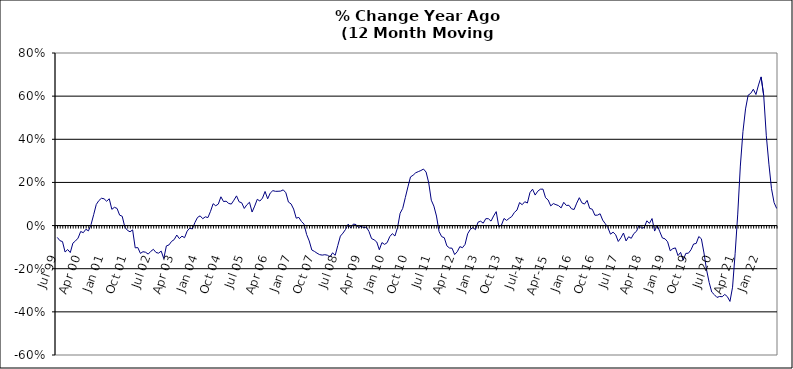
| Category | Series 0 |
|---|---|
| Jul 99 | -0.055 |
| Aug 99 | -0.07 |
| Sep 99 | -0.074 |
| Oct 99 | -0.123 |
| Nov 99 | -0.111 |
| Dec 99 | -0.125 |
| Jan 00 | -0.082 |
| Feb 00 | -0.071 |
| Mar 00 | -0.058 |
| Apr 00 | -0.027 |
| May 00 | -0.033 |
| Jun 00 | -0.017 |
| Jul 00 | -0.025 |
| Aug 00 | 0.005 |
| Sep 00 | 0.05 |
| Oct 00 | 0.098 |
| Nov 00 | 0.116 |
| Dec 00 | 0.127 |
| Jan 01 | 0.124 |
| Feb 01 | 0.113 |
| Mar 01 | 0.124 |
| Apr 01 | 0.075 |
| May 01 | 0.085 |
| Jun 01 | 0.08 |
| Jul 01 | 0.048 |
| Aug 01 | 0.043 |
| Sep 01 | -0.007 |
| Oct 01 | -0.022 |
| Nov 01 | -0.029 |
| Dec 01 | -0.02 |
| Jan 02 | -0.103 |
| Feb 02 | -0.102 |
| Mar 02 | -0.129 |
| Apr 02 | -0.121 |
| May 02 | -0.124 |
| Jun 02 | -0.132 |
| Jul 02 | -0.119 |
| Aug 02 | -0.11 |
| Sep 02 | -0.125 |
| Oct 02 | -0.128 |
| Nov 02 | -0.118 |
| Dec 02 | -0.153 |
| Jan 03 | -0.094 |
| Feb 03 | -0.09 |
| Mar 03 | -0.073 |
| Apr 03 | -0.065 |
| May 03 | -0.044 |
| Jun 03 | -0.06 |
| Jul 03 | -0.049 |
| Aug 03 | -0.056 |
| Sep 03 | -0.026 |
| Oct 03 | -0.012 |
| Nov 03 | -0.016 |
| Dec 03 | 0.014 |
| Jan 04 | 0.038 |
| Feb 04 | 0.045 |
| Mar 04 | 0.032 |
| Apr 04 | 0.041 |
| May 04 | 0.037 |
| Jun 04 | 0.066 |
| Jul 04 | 0.101 |
| Aug 04 | 0.092 |
| Sep 04 | 0.1 |
| Oct 04 | 0.133 |
| Nov 04 | 0.111 |
| Dec 04 | 0.113 |
| Jan 05 | 0.103 |
| Feb 05 | 0.1 |
| Mar 05 | 0.118 |
| Apr 05 | 0.138 |
| May 05 | 0.11 |
| Jun 05 | 0.106 |
| Jul 05 | 0.079 |
| Aug 05 | 0.097 |
| Sep 05 | 0.108 |
| Oct 05 | 0.063 |
| Nov 05 | 0.09 |
| Dec 05 | 0.122 |
| Jan 06 | 0.114 |
| Feb 06 | 0.127 |
| Mar 06 | 0.158 |
| Apr 06 | 0.124 |
| May 06 | 0.151 |
| Jun 06 | 0.162 |
| Jul 06 | 0.159 |
| Aug 06 | 0.159 |
| Sep 06 | 0.16 |
| Oct 06 | 0.166 |
| Nov 06 | 0.152 |
| Dec 06 | 0.109 |
| Jan 07 | 0.101 |
| Feb 07 | 0.076 |
| Mar 07 | 0.034 |
| Apr 07 | 0.038 |
| May 07 | 0.019 |
| Jun 07 | 0.007 |
| Jul 07 | -0.041 |
| Aug 07 | -0.071 |
| Sep 07 | -0.113 |
| Oct 07 | -0.12 |
| Nov 07 | -0.128 |
| Dec 07 | -0.135 |
| Jan 08 | -0.137 |
| Feb 08 | -0.135 |
| Mar 08 | -0.137 |
| Apr 08 | -0.145 |
| May 08 | -0.126 |
| Jun 08 | -0.138 |
| Jul 08 | -0.093 |
| Aug 08 | -0.049 |
| Sep-08 | -0.035 |
| Oct 08 | -0.018 |
| Nov 08 | 0.007 |
| Dec 08 | -0.011 |
| Jan 09 | 0.007 |
| Feb 09 | 0.005 |
| Mar 09 | -0.009 |
| Apr 09 | -0.003 |
| May 09 | -0.01 |
| Jun 09 | -0.007 |
| Jul 09 | -0.027 |
| Aug 09 | -0.06 |
| Sep 09 | -0.066 |
| Oct 09 | -0.076 |
| Nov 09 | -0.112 |
| Dec 09 | -0.079 |
| Jan 10 | -0.087 |
| Feb 10 | -0.079 |
| Mar 10 | -0.052 |
| Apr 10 | -0.037 |
| May 10 | -0.048 |
| Jun 10 | -0.01 |
| Jul 10 | 0.057 |
| Aug 10 | 0.08 |
| Sep 10 | 0.13 |
| Oct 10 | 0.179 |
| Nov 10 | 0.226 |
| Dec 10 | 0.233 |
| Jan 11 | 0.245 |
| Feb 11 | 0.25 |
| Mar 11 | 0.255 |
| Apr 11 | 0.262 |
| May 11 | 0.248 |
| Jun 11 | 0.199 |
| Jul 11 | 0.118 |
| Aug 11 | 0.09 |
| Sep 11 | 0.044 |
| Oct 11 | -0.028 |
| Nov 11 | -0.051 |
| Dec 11 | -0.056 |
| Jan 12 | -0.094 |
| Feb 12 | -0.104 |
| Mar 12 | -0.105 |
| Apr 12 | -0.134 |
| May 12 | -0.121 |
| Jun 12 | -0.098 |
| Jul 12 | -0.103 |
| Aug 12 | -0.087 |
| Sep 12 | -0.038 |
| Oct 12 | -0.018 |
| Nov 12 | -0.009 |
| Dec 12 | -0.019 |
| Jan 13 | 0.016 |
| Feb-13 | 0.02 |
| Mar-13 | 0.011 |
| Apr 13 | 0.032 |
| May 13 | 0.032 |
| Jun-13 | 0.021 |
| Jul 13 | 0.045 |
| Aug 13 | 0.065 |
| Sep 13 | -0.005 |
| Oct 13 | 0.002 |
| Nov 13 | 0.033 |
| Dec 13 | 0.024 |
| Jan 14 | 0.034 |
| Feb-14 | 0.042 |
| Mar 14 | 0.061 |
| Apr 14 | 0.072 |
| May 14 | 0.107 |
| Jun 14 | 0.097 |
| Jul-14 | 0.111 |
| Aug-14 | 0.105 |
| Sep 14 | 0.153 |
| Oct 14 | 0.169 |
| Nov 14 | 0.141 |
| Dec 14 | 0.159 |
| Jan 15 | 0.169 |
| Feb 15 | 0.169 |
| Mar 15 | 0.129 |
| Apr-15 | 0.118 |
| May 15 | 0.091 |
| Jun-15 | 0.102 |
| Jul 15 | 0.097 |
| Aug 15 | 0.092 |
| Sep 15 | 0.082 |
| Oct 15 | 0.108 |
| Nov 15 | 0.093 |
| Dec 15 | 0.094 |
| Jan 16 | 0.078 |
| Feb 16 | 0.075 |
| Mar 16 | 0.104 |
| Apr 16 | 0.129 |
| May 16 | 0.105 |
| Jun 16 | 0.1 |
| Jul 16 | 0.117 |
| Aug 16 | 0.08 |
| Sep 16 | 0.076 |
| Oct 16 | 0.048 |
| Nov 16 | 0.048 |
| Dec 16 | 0.055 |
| Jan 17 | 0.025 |
| Feb 17 | 0.009 |
| Mar 17 | -0.01 |
| Apr 17 | -0.04 |
| May 17 | -0.031 |
| Jun 17 | -0.042 |
| Jul 17 | -0.074 |
| Aug 17 | -0.057 |
| Sep 17 | -0.035 |
| Oct 17 | -0.071 |
| Nov 17 | -0.052 |
| Dec 17 | -0.059 |
| Jan 18 | -0.037 |
| Feb 18 | -0.027 |
| Mar 18 | 0 |
| Apr 18 | -0.012 |
| May 18 | -0.009 |
| Jun 18 | 0.022 |
| Jul 18 | 0.01 |
| Aug 18 | 0.033 |
| Sep 18 | -0.025 |
| Oct 18 | 0.002 |
| Nov 18 | -0.029 |
| Dec 18 | -0.058 |
| Jan 19 | -0.061 |
| Feb 19 | -0.075 |
| Mar 19 | -0.117 |
| Apr 19 | -0.107 |
| May 19 | -0.104 |
| Jun 19 | -0.139 |
| Jul 19 | -0.124 |
| Aug 19 | -0.16 |
| Sep 19 | -0.129 |
| Oct 19 | -0.128 |
| Nov 19 | -0.112 |
| Dec 19 | -0.085 |
| Jan 20 | -0.083 |
| Feb 20 | -0.051 |
| Mar 20 | -0.061 |
| Apr 20 | -0.127 |
| May 20 | -0.206 |
| Jun 20 | -0.264 |
| Jul 20 | -0.308 |
| Aug 20 | -0.32 |
| Sep 20 | -0.333 |
| Oct 20 | -0.329 |
| Nov 20 | -0.33 |
| Dec 20 | -0.319 |
| Jan 21 | -0.329 |
| Feb 21 | -0.352 |
| Mar 21 | -0.286 |
| Apr 21 | -0.129 |
| May 21 | 0.053 |
| Jun 21 | 0.276 |
| Jul 21 | 0.435 |
| Aug 21 | 0.541 |
| Sep 21 | 0.604 |
| Oct 21 | 0.613 |
| Nov 21 | 0.632 |
| Dec 21 | 0.608 |
| Jan 22 | 0.652 |
| Feb 22 | 0.689 |
| Mar 22 | 0.603 |
| Apr 22 | 0.416 |
| May 22 | 0.285 |
| Jun 22 | 0.171 |
| Jul 22 | 0.106 |
| Aug 22 | 0.079 |